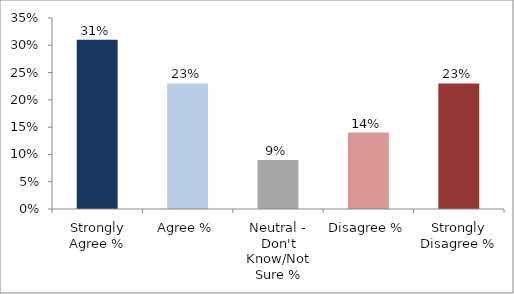
| Category | Share |
|---|---|
| Strongly Agree % | 0.31 |
| Agree % | 0.23 |
| Neutral - Don't Know/Not Sure % | 0.09 |
| Disagree % | 0.14 |
| Strongly Disagree % | 0.23 |